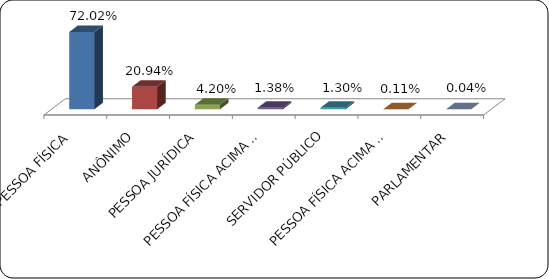
| Category | Series 0 |
|---|---|
|      PESSOA FÍSICA | 0.72 |
|      ANÔNIMO | 0.209 |
|      PESSOA JURÍDICA | 0.042 |
|      PESSOA FÍSICA ACIMA DE 60 ANOS | 0.014 |
|      SERVIDOR PÚBLICO | 0.013 |
|      PESSOA FÍSICA ACIMA DE 80 ANOS | 0.001 |
|      PARLAMENTAR | 0 |